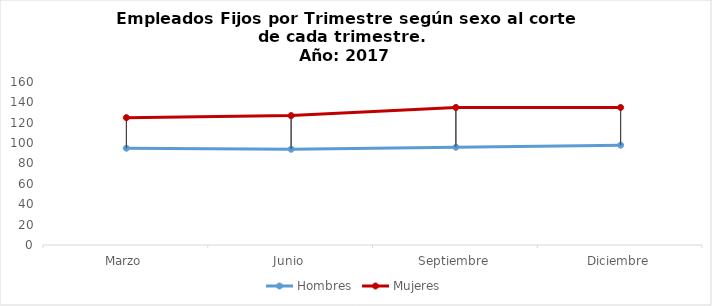
| Category | Hombres | Mujeres |
|---|---|---|
| Marzo | 95 | 125 |
| Junio | 94 | 127 |
| Septiembre | 96 | 135 |
| Diciembre | 98 | 135 |